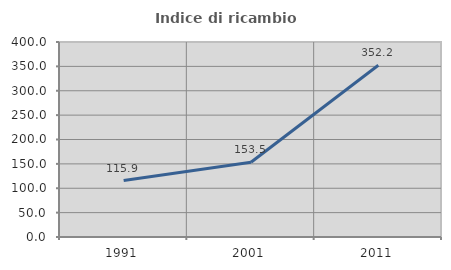
| Category | Indice di ricambio occupazionale  |
|---|---|
| 1991.0 | 115.894 |
| 2001.0 | 153.472 |
| 2011.0 | 352.174 |